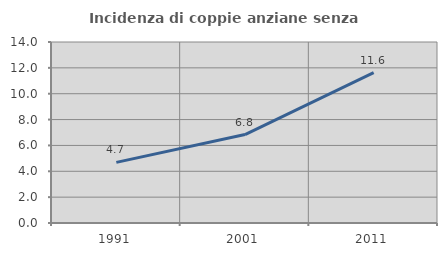
| Category | Incidenza di coppie anziane senza figli  |
|---|---|
| 1991.0 | 4.69 |
| 2001.0 | 6.84 |
| 2011.0 | 11.624 |